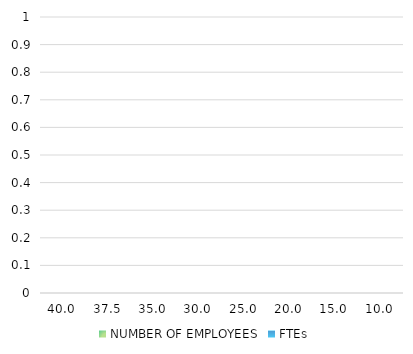
| Category | NUMBER OF EMPLOYEES | FTEs |
|---|---|---|
| 40.0 |  | 0 |
| 37.5 |  | 0 |
| 35.0 |  | 0 |
| 30.0 |  | 0 |
| 25.0 |  | 0 |
| 20.0 |  | 0 |
| 15.0 |  | 0 |
| 10.0 |  | 0 |